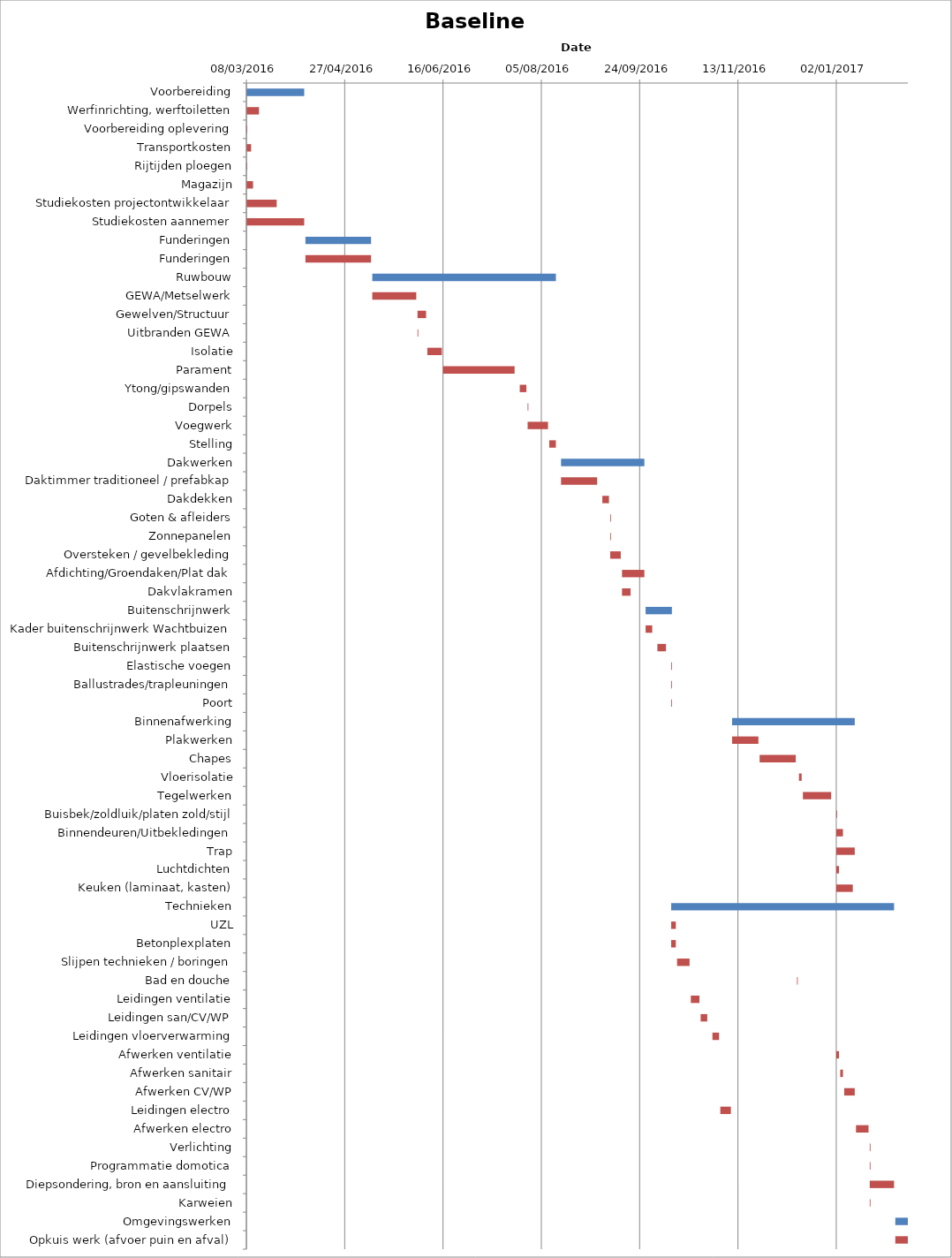
| Category | Baseline start | Actual duration |
|---|---|---|
| Voorbereiding | 42437.333 | 29.375 |
| Werfinrichting, werftoiletten | 42437.333 | 6.375 |
| Voorbereiding oplevering | 42437.333 | 0.375 |
| Transportkosten | 42437.333 | 2.375 |
| Rijtijden ploegen | 42437.333 | 0.375 |
| Magazijn | 42437.333 | 3.375 |
| Studiekosten projectontwikkelaar | 42437.333 | 15.375 |
| Studiekosten aannemer | 42437.333 | 29.375 |
| Funderingen | 42467.333 | 33.375 |
| Funderingen | 42467.333 | 33.375 |
| Ruwbouw | 42501.333 | 93.375 |
| GEWA/Metselwerk | 42501.333 | 22.375 |
| Gewelven/Structuur | 42524.333 | 4.375 |
| Uitbranden GEWA | 42524.333 | 0.375 |
| Isolatie | 42529.333 | 7.375 |
| Parament | 42537.333 | 36.375 |
| Ytong/gipswanden | 42576.333 | 3.375 |
| Dorpels | 42580.333 | 0.375 |
| Voegwerk | 42580.333 | 10.375 |
| Stelling | 42591.333 | 3.375 |
| Dakwerken | 42597.333 | 42.375 |
| Daktimmer traditioneel / prefabkap | 42597.333 | 18.375 |
| Dakdekken | 42618.333 | 3.375 |
| Goten & afleiders | 42622.333 | 0.375 |
| Zonnepanelen | 42622.333 | 0.375 |
| Oversteken / gevelbekleding | 42622.333 | 5.375 |
| Afdichting/Groendaken/Plat dak | 42628.333 | 11.375 |
| Dakvlakramen | 42628.333 | 4.375 |
| Buitenschrijnwerk | 42640.333 | 13.375 |
| Kader buitenschrijnwerk Wachtbuizen | 42640.333 | 3.375 |
| Buitenschrijnwerk plaatsen | 42646.333 | 4.375 |
| Elastische voegen | 42653.333 | 0.375 |
| Ballustrades/trapleuningen | 42653.333 | 0.375 |
| Poort | 42653.333 | 0.375 |
| Binnenafwerking | 42684.333 | 62.375 |
| Plakwerken | 42684.333 | 13.375 |
| Chapes | 42698.333 | 18.375 |
| Vloerisolatie | 42718.333 | 1.375 |
| Tegelwerken | 42720.333 | 14.375 |
| Buisbek/zoldluik/platen zold/stijl | 42737.333 | 0.375 |
| Binnendeuren/Uitbekledingen | 42737.333 | 3.375 |
| Trap | 42737.333 | 9.375 |
| Luchtdichten | 42737.333 | 1.375 |
| Keuken (laminaat, kasten) | 42737.333 | 8.375 |
| Technieken | 42653.333 | 113.375 |
| UZL | 42653.333 | 2.375 |
| Betonplexplaten | 42653.333 | 2.375 |
| Slijpen technieken / boringen | 42656.333 | 6.375 |
| Bad en douche | 42717.333 | 0.375 |
| Leidingen ventilatie | 42663.333 | 4.375 |
| Leidingen san/CV/WP | 42668.333 | 3.375 |
| Leidingen vloerverwarming | 42674.333 | 3.375 |
| Afwerken ventilatie | 42737.333 | 1.375 |
| Afwerken sanitair | 42739.333 | 1.375 |
| Afwerken CV/WP | 42741.333 | 5.375 |
| Leidingen electro | 42678.333 | 5.375 |
| Afwerken electro | 42747.333 | 6.375 |
| Verlichting | 42754.333 | 0.375 |
| Programmatie domotica | 42754.333 | 0.375 |
| Diepsondering, bron en aansluiting | 42754.333 | 12.375 |
| Karweien | 42754.333 | 0.375 |
| Omgevingswerken | 42767.333 | 6.375 |
| Opkuis werk (afvoer puin en afval) | 42767.333 | 6.375 |